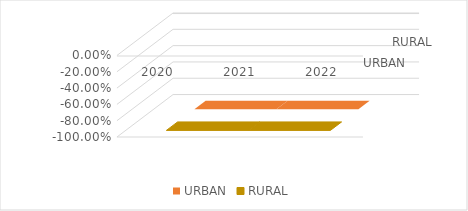
| Category | URBAN | RURAL |
|---|---|---|
| 2020.0 | -1 | -1 |
| 2021.0 | -1 | -1 |
| 2022.0 | -1 | -1 |